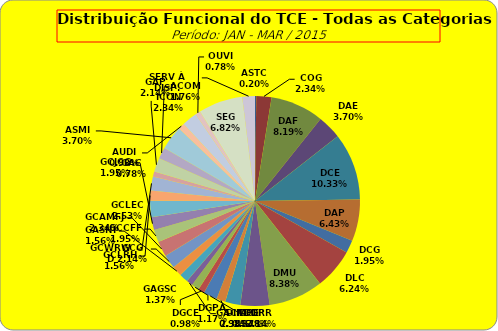
| Category | ASTC COG DAF DAE DCE DAP DCG DLC DMU DGP DIN DPE DRR DGCE DGPA GACMG GAGSC GASNI GCG GCAMFJ GCCFF GCJCG GCLEC GCLRH GCWRWD GAC GAP ACOM ASMI AUDI ICON OUVI SEG SERV À DISP. |
|---|---|
| ASTC | 1 |
| COG | 12 |
| DAF | 42 |
| DAE | 19 |
| DCE | 53 |
| DAP | 33 |
| DCG | 10 |
| DLC | 32 |
| DMU | 43 |
| DGP | 23 |
| DIN | 12 |
| DPE | 7 |
| DRR | 11 |
| DGCE | 5 |
| DGPA | 6 |
| GACMG | 5 |
| GAGSC | 7 |
| GASNI | 8 |
| GCG | 11 |
| GCAMFJ | 12 |
| GCCFF | 10 |
| GCJCG | 10 |
| GCLEC | 13 |
| GCLRH | 8 |
| GCWRWD | 11 |
| GAC | 4 |
| GAP | 11 |
| ACOM | 9 |
| ASMI | 19 |
| AUDI | 5 |
| ICON | 12 |
| OUVI | 4 |
| SEG | 35 |
| SERV À DISP. | 10 |